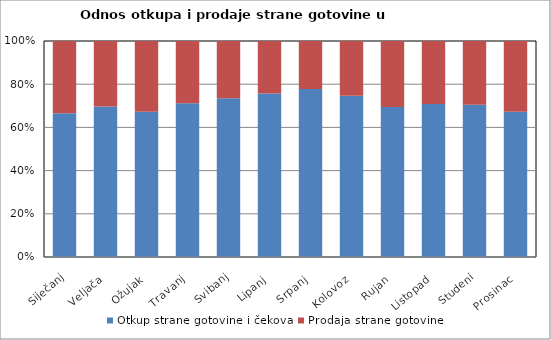
| Category | Otkup strane gotovine i čekova  | Prodaja strane gotovine  |
|---|---|---|
| Siječanj | 1067761812 | 535738244 |
| Veljača | 1130901961 | 491795693 |
| Ožujak | 748872803 | 363876238 |
| Travanj | 402176833 | 162716103 |
| Svibanj | 764622463 | 275741967 |
| Lipanj | 1322657526 | 425641609 |
| Srpanj | 2254151709 | 644690839 |
| Kolovoz | 2189511945 | 745132329 |
| Rujan | 1152934330 | 506519880 |
| Listopad | 1083581656 | 445001082 |
| Studeni | 881540066 | 370056660 |
| Prosinac | 855292729 | 416104699 |